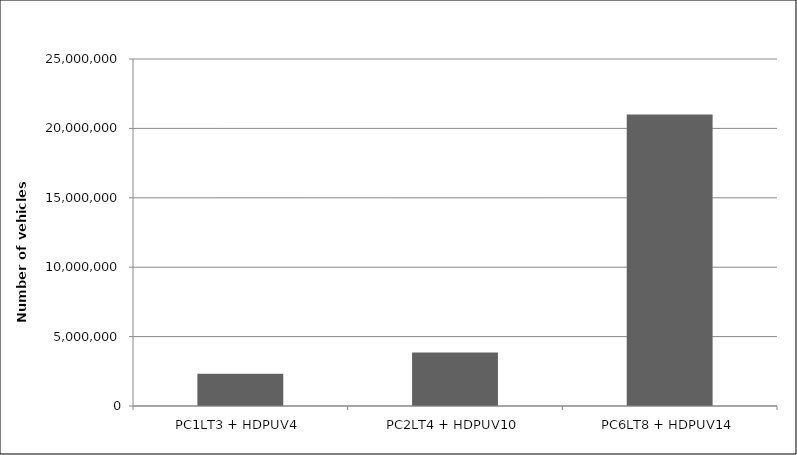
| Category | Number of Vehicles Removed from Fleet Corresponding to Emissions Reductions from Baseline Alternative |
|---|---|
| PC1LT3 + HDPUV4 | 2314603.86 |
| PC2LT4 + HDPUV10 | 3848232.06 |
| PC6LT8 + HDPUV14 | 20995154.401 |